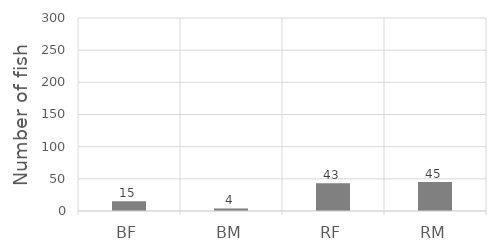
| Category | Series 0 |
|---|---|
| BF | 15 |
| BM | 4 |
| RF | 43 |
| RM | 45 |